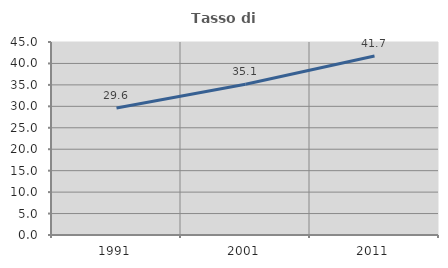
| Category | Tasso di occupazione   |
|---|---|
| 1991.0 | 29.631 |
| 2001.0 | 35.138 |
| 2011.0 | 41.743 |